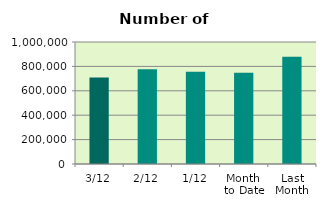
| Category | Series 0 |
|---|---|
| 3/12 | 709054 |
| 2/12 | 777358 |
| 1/12 | 756222 |
| Month 
to Date | 747544.667 |
| Last
Month | 879957.333 |